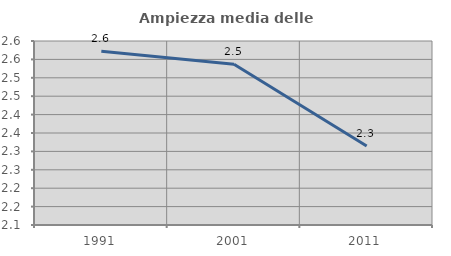
| Category | Ampiezza media delle famiglie |
|---|---|
| 1991.0 | 2.572 |
| 2001.0 | 2.537 |
| 2011.0 | 2.315 |